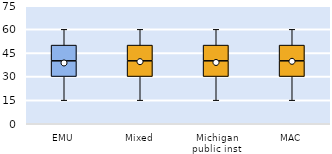
| Category | 25th | 50th | 75th |
|---|---|---|---|
| EMU | 30 | 10 | 10 |
| Mixed | 30 | 10 | 10 |
| Michigan public inst | 30 | 10 | 10 |
| MAC | 30 | 10 | 10 |